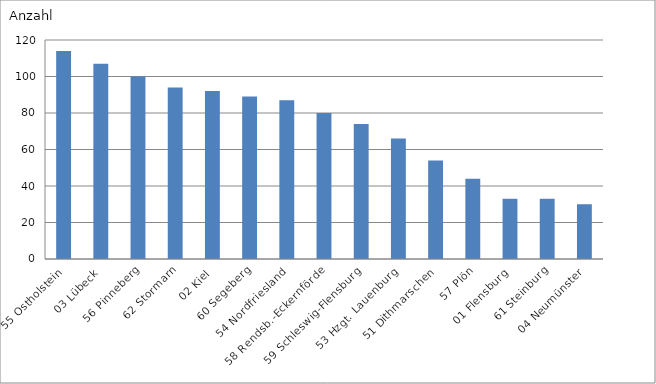
| Category | 55 Ostholstein |
|---|---|
| 55 Ostholstein | 114 |
| 03 Lübeck | 107 |
| 56 Pinneberg | 100 |
| 62 Stormarn | 94 |
| 02 Kiel | 92 |
| 60 Segeberg | 89 |
| 54 Nordfriesland | 87 |
| 58 Rendsb.-Eckernförde | 80 |
| 59 Schleswig-Flensburg | 74 |
| 53 Hzgt. Lauenburg | 66 |
| 51 Dithmarschen | 54 |
| 57 Plön | 44 |
| 01 Flensburg | 33 |
| 61 Steinburg | 33 |
| 04 Neumünster | 30 |